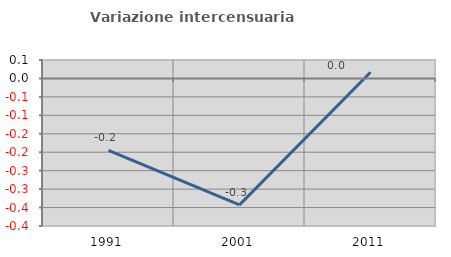
| Category | Variazione intercensuaria annua |
|---|---|
| 1991.0 | -0.195 |
| 2001.0 | -0.343 |
| 2011.0 | 0.017 |